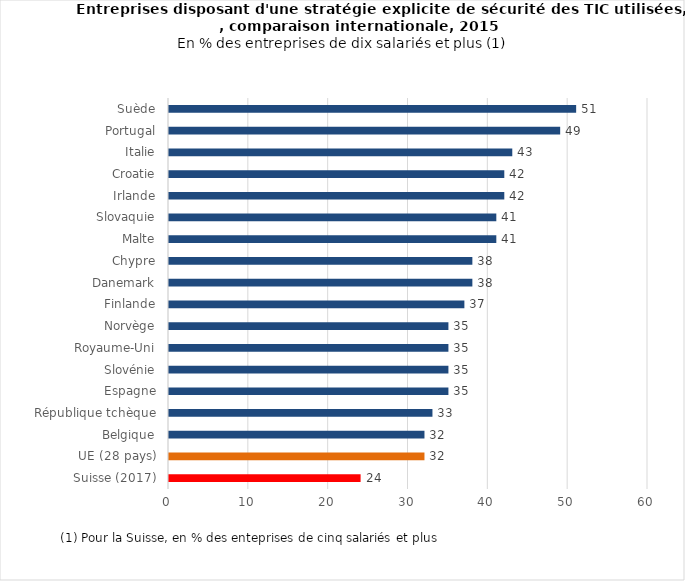
| Category | Series 0 |
|---|---|
| Suisse (2017) | 24 |
| UE (28 pays) | 32 |
| Belgique | 32 |
| République tchèque | 33 |
| Espagne | 35 |
| Slovénie | 35 |
| Royaume-Uni | 35 |
| Norvège | 35 |
| Finlande | 37 |
| Danemark | 38 |
| Chypre | 38 |
| Malte | 41 |
| Slovaquie | 41 |
| Irlande | 42 |
| Croatie | 42 |
| Italie | 43 |
| Portugal | 49 |
| Suède | 51 |